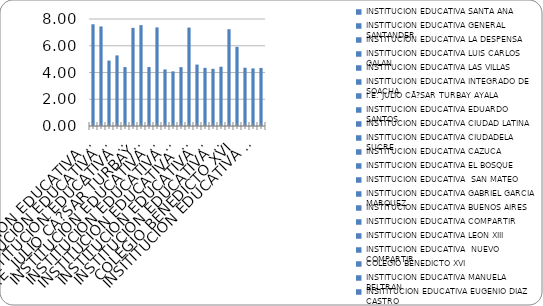
| Category | ISCE 2018 Media |
|---|---|
| INSTITUCION EDUCATIVA SANTA ANA | 7.605 |
| INSTITUCION EDUCATIVA GENERAL SANTANDER | 7.443 |
| INSTITUCION EDUCATIVA LA DESPENSA | 4.892 |
| INSTITUCION EDUCATIVA LUIS CARLOS GALAN | 5.279 |
| INSTITUCION EDUCATIVA LAS VILLAS | 4.406 |
| INSTITUCION EDUCATIVA INTEGRADO DE SOACHA | 7.338 |
| I.E. JULIO CÃ?SAR TURBAY AYALA | 7.541 |
| INSTITUCION EDUCATIVA EDUARDO SANTOS | 4.408 |
| INSTITUCION EDUCATIVA CIUDAD LATINA | 7.372 |
| INSTITUCION EDUCATIVA CIUDADELA  SUCRE | 4.229 |
| INSTITUCION EDUCATIVA CAZUCA | 4.084 |
| INSTITUCION EDUCATIVA EL BOSQUE | 4.399 |
| INSTITUCION EDUCATIVA  SAN MATEO | 7.358 |
| INSTITUCION EDUCATIVA GABRIEL GARCIA MARQUEZ | 4.591 |
| INSTITUCION EDUCATIVA BUENOS AIRES | 4.348 |
| INSTITUCION EDUCATIVA COMPARTIR | 4.274 |
| INSTITUCION EDUCATIVA LEON XIII | 4.431 |
| INSTITUCION EDUCATIVA  NUEVO COMPARTIR | 7.237 |
| COLEGIO BENEDICTO XVI | 5.918 |
| INSTITUCION EDUCATIVA MANUELA BELTRAN | 4.358 |
| INSITITUCION EDUCATIVA EUGENIO DIAZ CASTRO | 4.308 |
| INSTITUCION EDUCATIVA  RICAURTE | 4.341 |